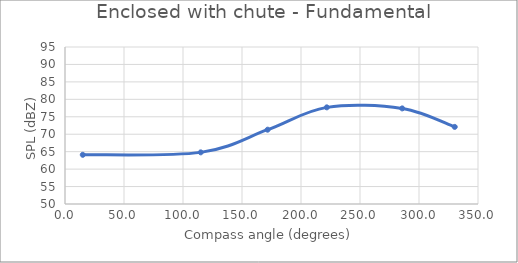
| Category | Series 0 |
|---|---|
| 15.06445125542554 | 64.1 |
| 115.00449447818254 | 64.8 |
| 171.7068171198818 | 71.3 |
| 221.8691292075067 | 77.7 |
| 285.7828166838848 | 77.4 |
| 330.28010595813004 | 72.1 |